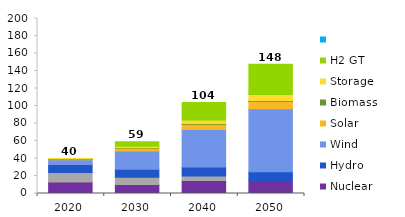
| Category | Nuclear | CH4 GT | Hydro | Wind | Solar | Biomass | Storage | H2 GT | Series 8 | Series 9 |
|---|---|---|---|---|---|---|---|---|---|---|
| 2020.0 | 13.089 | 10.77 | 9.255 | 5.534 | 0.478 | 0.561 | 0.175 | 0 |  | 39.861 |
| 2030.0 | 10.307 | 8.18 | 9.272 | 20.684 | 3.653 | 0.561 | 1.473 | 5.11 |  | 59.24 |
| 2040.0 | 14.941 | 5.19 | 10.022 | 42.934 | 5.95 | 0.831 | 4.097 | 20.11 |  | 104.075 |
| 2050.0 | 14.941 | 0 | 10.022 | 71.831 | 8.492 | 1.112 | 6.697 | 34.529 |  | 147.624 |